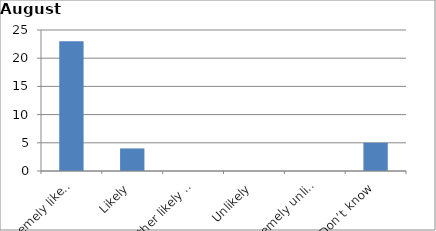
| Category | Series 0 |
|---|---|
| Extremely likely | 23 |
| Likely | 4 |
| Neither likely nor unlikely | 0 |
| Unlikely | 0 |
| Extremely unlikely | 0 |
| Don’t know | 5 |